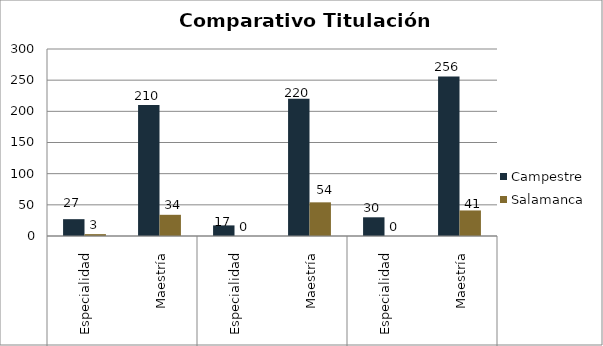
| Category | Campestre | Salamanca |
|---|---|---|
| 0 | 27 | 3 |
| 1 | 210 | 34 |
| 2 | 17 | 0 |
| 3 | 220 | 54 |
| 4 | 30 | 0 |
| 5 | 256 | 41 |